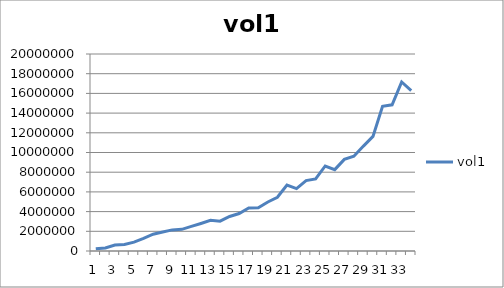
| Category | vol1 |
|---|---|
| 0 | 216847 |
| 1 | 306948 |
| 2 | 608003 |
| 3 | 655156 |
| 4 | 895252.333 |
| 5 | 1284276 |
| 6 | 1706998 |
| 7 | 1924476.333 |
| 8 | 2142817.333 |
| 9 | 2195717.333 |
| 10 | 2494903 |
| 11 | 2794054 |
| 12 | 3111948 |
| 13 | 3027824 |
| 14 | 3501663.667 |
| 15 | 3803348.667 |
| 16 | 4375456.333 |
| 17 | 4378634.667 |
| 18 | 4973383 |
| 19 | 5457700.333 |
| 20 | 6688347.667 |
| 21 | 6341299 |
| 22 | 7144771.667 |
| 23 | 7322923.667 |
| 24 | 8631964.333 |
| 25 | 8261590.333 |
| 26 | 9303752.667 |
| 27 | 9621819 |
| 28 | 10651836.333 |
| 29 | 11632043 |
| 30 | 14685199.333 |
| 31 | 14841883.667 |
| 32 | 17158649 |
| 33 | 16281367.667 |